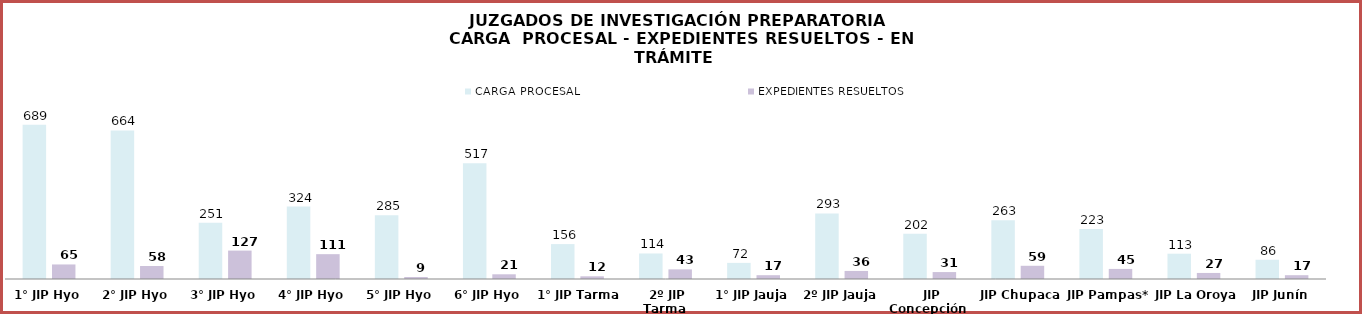
| Category | CARGA PROCESAL | EXPEDIENTES RESUELTOS |
|---|---|---|
| 1° JIP Hyo | 689 | 65 |
| 2° JIP Hyo | 664 | 58 |
| 3° JIP Hyo | 251 | 127 |
| 4° JIP Hyo | 324 | 111 |
| 5° JIP Hyo | 285 | 9 |
| 6° JIP Hyo | 517 | 21 |
| 1° JIP Tarma | 156 | 12 |
| 2º JIP Tarma | 114 | 43 |
| 1° JIP Jauja | 72 | 17 |
| 2º JIP Jauja | 293 | 36 |
| JIP Concepción | 202 | 31 |
| JIP Chupaca | 263 | 59 |
| JIP Pampas*  | 223 | 45 |
| JIP La Oroya | 113 | 27 |
| JIP Junín | 86 | 17 |